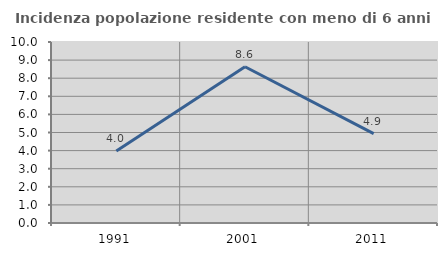
| Category | Incidenza popolazione residente con meno di 6 anni |
|---|---|
| 1991.0 | 3.974 |
| 2001.0 | 8.633 |
| 2011.0 | 4.938 |